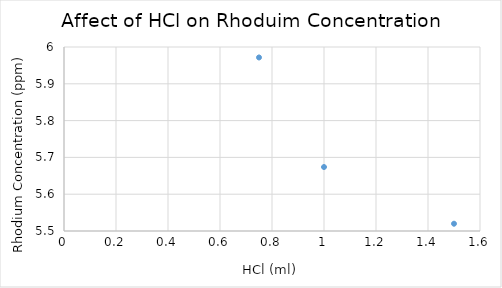
| Category | Series 0 |
|---|---|
| 1.5 | 5.52 |
| 1.0 | 5.674 |
| 0.75 | 5.972 |